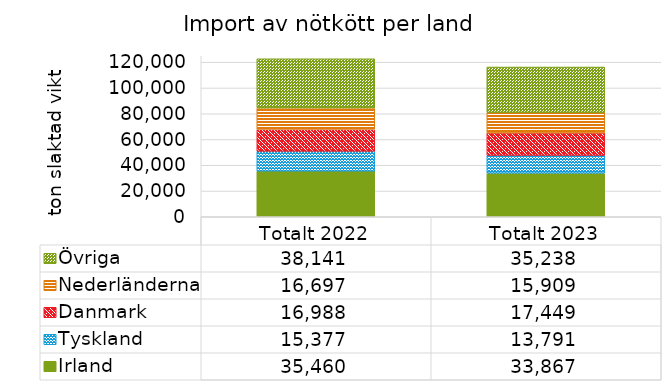
| Category | Irland | Tyskland | Danmark | Nederländerna | Övriga |
|---|---|---|---|---|---|
| Totalt 2022 | 35459.8 | 15376.943 | 16988.4 | 16696.686 | 38140.571 |
| Totalt 2023 | 33866.571 | 13790.886 | 17449.314 | 15909.143 | 35237.657 |